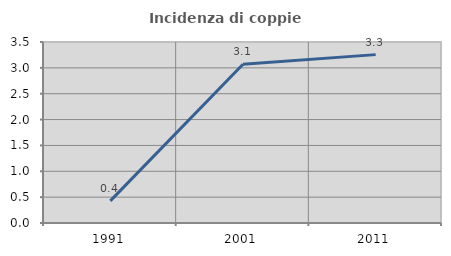
| Category | Incidenza di coppie miste |
|---|---|
| 1991.0 | 0.427 |
| 2001.0 | 3.07 |
| 2011.0 | 3.256 |